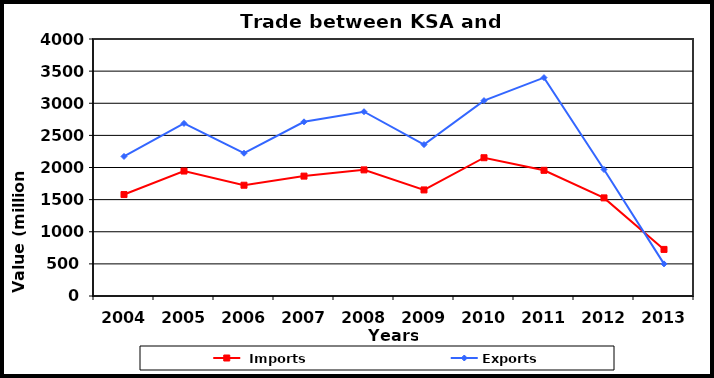
| Category |  Imports | Exports |
|---|---|---|
| 2004.0 | 1579 | 2172 |
| 2005.0 | 1945 | 2686 |
| 2006.0 | 1724 | 2222 |
| 2007.0 | 1866 | 2711 |
| 2008.0 | 1963 | 2868 |
| 2009.0 | 1651 | 2357 |
| 2010.0 | 2152 | 3041 |
| 2011.0 | 1956 | 3399 |
| 2012.0 | 1527 | 1969 |
| 2013.0 | 725 | 500 |